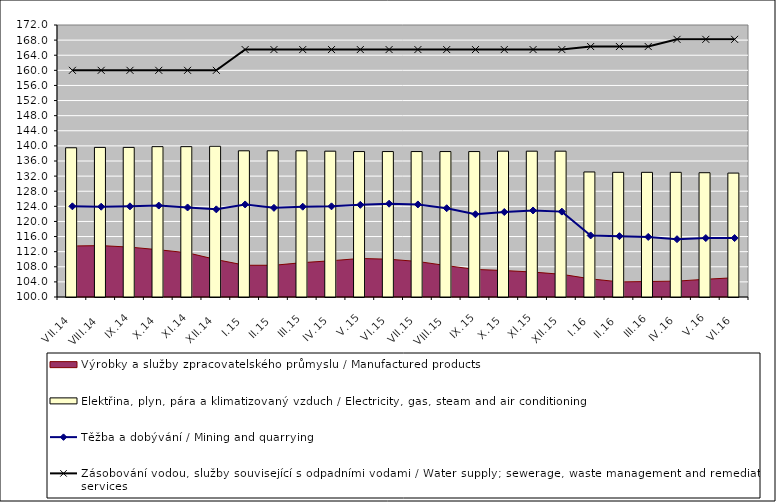
| Category | Elektřina, plyn, pára a klimatizovaný vzduch / Electricity, gas, steam and air conditioning |
|---|---|
| VII.14 | 139.5 |
| VIII.14 | 139.6 |
| IX.14 | 139.6 |
| X.14 | 139.8 |
| XI.14 | 139.8 |
| XII.14 | 139.9 |
| I.15 | 138.7 |
| II.15 | 138.7 |
| III.15 | 138.7 |
| IV.15 | 138.6 |
| V.15 | 138.5 |
| VI.15 | 138.5 |
| VII.15 | 138.5 |
| VIII.15 | 138.5 |
| IX.15 | 138.5 |
| X.15 | 138.6 |
| XI.15 | 138.6 |
| XII.15 | 138.6 |
| I.16 | 133.1 |
| II.16 | 133 |
| III.16 | 133 |
| IV.16 | 133 |
| V.16 | 132.9 |
| VI.16 | 132.8 |